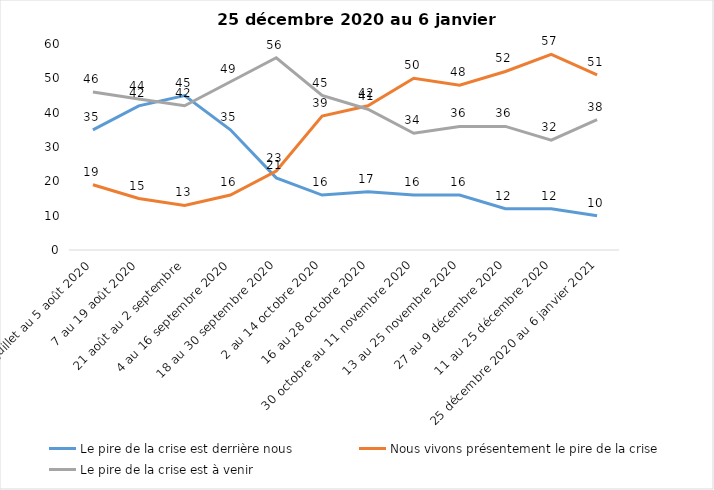
| Category | Le pire de la crise est derrière nous | Nous vivons présentement le pire de la crise | Le pire de la crise est à venir |
|---|---|---|---|
| 24 juillet au 5 août 2020 | 35 | 19 | 46 |
| 7 au 19 août 2020 | 42 | 15 | 44 |
| 21 août au 2 septembre | 45 | 13 | 42 |
| 4 au 16 septembre 2020 | 35 | 16 | 49 |
| 18 au 30 septembre 2020 | 21 | 23 | 56 |
| 2 au 14 octobre 2020 | 16 | 39 | 45 |
| 16 au 28 octobre 2020 | 17 | 42 | 41 |
| 30 octobre au 11 novembre 2020 | 16 | 50 | 34 |
| 13 au 25 novembre 2020 | 16 | 48 | 36 |
| 27 au 9 décembre 2020 | 12 | 52 | 36 |
| 11 au 25 décembre 2020 | 12 | 57 | 32 |
| 25 décembre 2020 au 6 janvier 2021 | 10 | 51 | 38 |